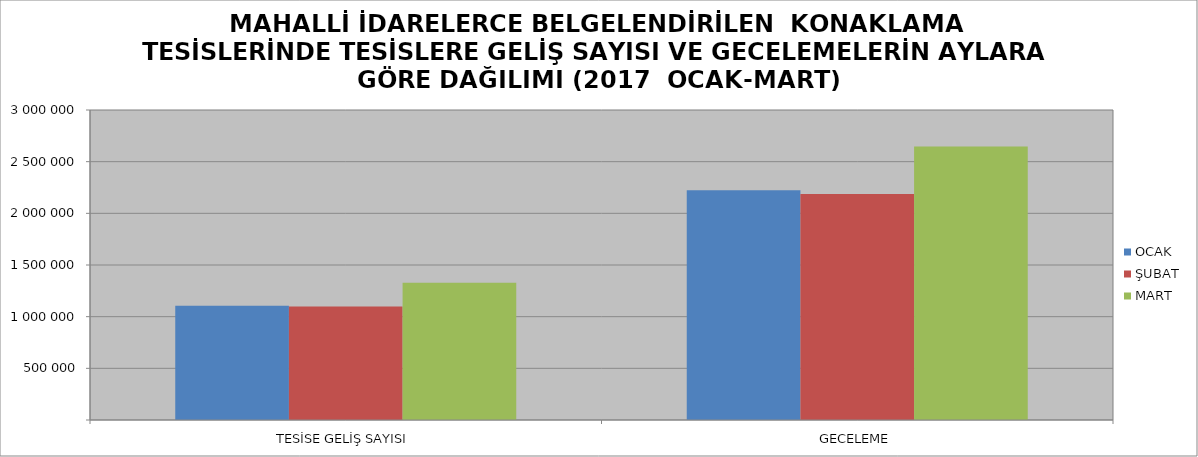
| Category | OCAK | ŞUBAT | MART |
|---|---|---|---|
| TESİSE GELİŞ SAYISI | 1104649 | 1099366 | 1327993 |
| GECELEME | 2222261 | 2187982 | 2645959 |